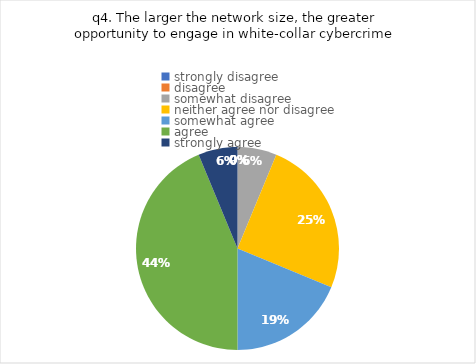
| Category | Series 0 |
|---|---|
| strongly disagree | 0 |
| disagree | 0 |
| somewhat disagree | 1 |
| neither agree nor disagree | 4 |
| somewhat agree | 3 |
| agree | 7 |
| strongly agree | 1 |